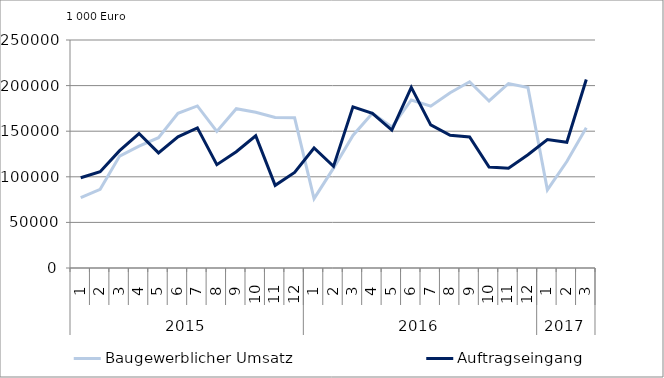
| Category | Baugewerblicher Umsatz | Auftragseingang |
|---|---|---|
| 0 | 77137.228 | 99023.008 |
| 1 | 86257.027 | 105491.844 |
| 2 | 122760.234 | 128704.324 |
| 3 | 133614.814 | 147438.665 |
| 4 | 142869.83 | 126182.175 |
| 5 | 169564.381 | 143879.815 |
| 6 | 177708.819 | 153660.001 |
| 7 | 149762.789 | 113338.261 |
| 8 | 174633.481 | 127520.775 |
| 9 | 170827.145 | 144931.886 |
| 10 | 165122.384 | 90621.16 |
| 11 | 164674.971 | 104795.622 |
| 12 | 76043.538 | 131571.482 |
| 13 | 109483.268 | 111467.248 |
| 14 | 145343.559 | 176673.268 |
| 15 | 169660.551 | 169566.96 |
| 16 | 154554.865 | 151228.165 |
| 17 | 184236.137 | 198035.655 |
| 18 | 177444.278 | 156900.898 |
| 19 | 192230.472 | 145537.167 |
| 20 | 204178.065 | 143616.217 |
| 21 | 183173.849 | 110770.94 |
| 22 | 202302.279 | 109384.188 |
| 23 | 197832.096 | 124193.91 |
| 24 | 85701.947 | 140751.008 |
| 25 | 116743.276 | 137863.383 |
| 26 | 153810.055 | 206710.579 |